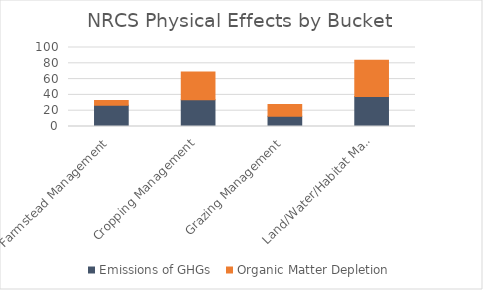
| Category | Emissions of GHGs  | Organic Matter Depletion |
|---|---|---|
| Farmstead Management | 27 | 6 |
| Cropping Management | 34 | 35 |
| Grazing Management | 13 | 15 |
| Land/Water/Habitat Management | 38 | 46 |